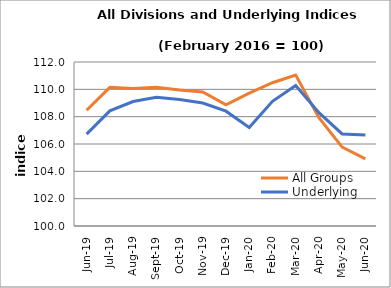
| Category | All Groups | Underlying |
|---|---|---|
| 2019-06-01 | 108.473 | 106.721 |
| 2019-07-01 | 110.146 | 108.423 |
| 2019-08-01 | 110.057 | 109.11 |
| 2019-09-01 | 110.148 | 109.423 |
| 2019-10-01 | 109.943 | 109.256 |
| 2019-11-01 | 109.811 | 108.998 |
| 2019-12-01 | 108.864 | 108.4 |
| 2020-01-01 | 109.718 | 107.211 |
| 2020-02-01 | 110.483 | 109.121 |
| 2020-03-01 | 111.043 | 110.276 |
| 2020-04-01 | 107.93 | 108.297 |
| 2020-05-01 | 105.77 | 106.735 |
| 2020-06-01 | 104.913 | 106.661 |